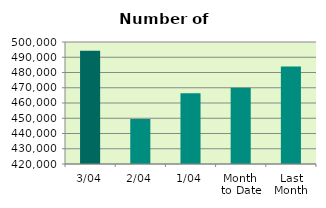
| Category | Series 0 |
|---|---|
| 3/04 | 494216 |
| 2/04 | 449528 |
| 1/04 | 466466 |
| Month 
to Date | 470070 |
| Last
Month | 483948.286 |